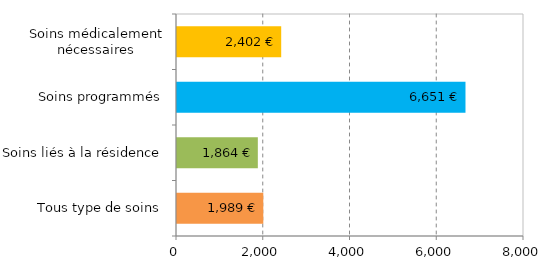
| Category | Series 0 |
|---|---|
| Tous type de soins | 1989.418 |
| Soins liés à la résidence | 1863.601 |
| Soins programmés | 6650.854 |
| Soins médicalement nécessaires | 2402.43 |